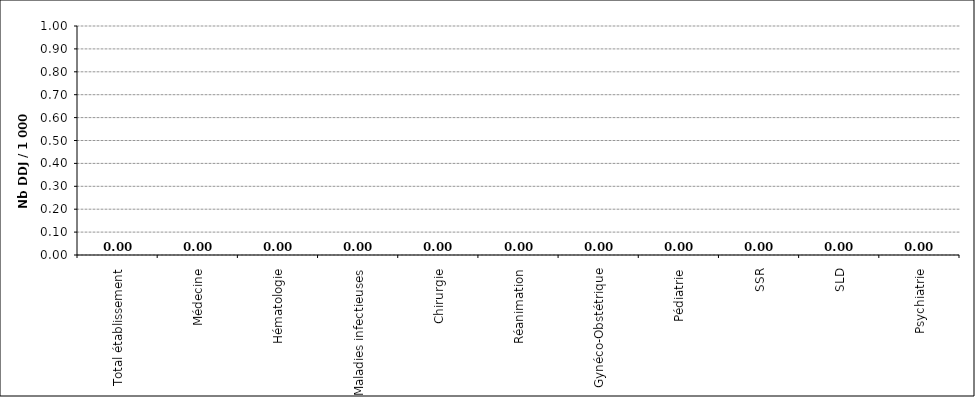
| Category | Series 0 |
|---|---|
| Total établissement | 0 |
| Médecine | 0 |
| Hématologie | 0 |
| Maladies infectieuses | 0 |
| Chirurgie | 0 |
| Réanimation | 0 |
| Gynéco-Obstétrique | 0 |
| Pédiatrie | 0 |
| SSR | 0 |
| SLD | 0 |
| Psychiatrie | 0 |